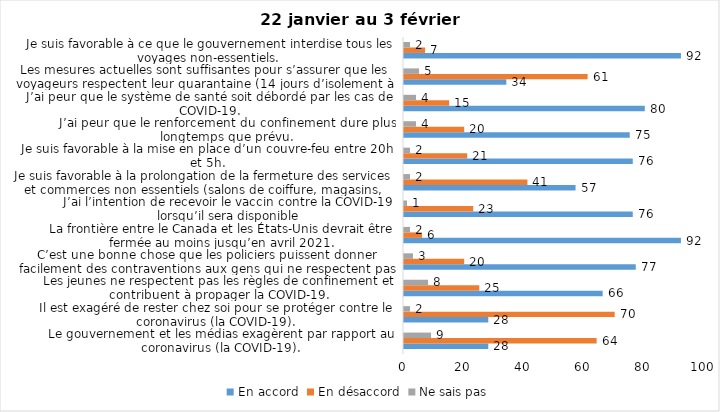
| Category | En accord | En désaccord | Ne sais pas |
|---|---|---|---|
| Le gouvernement et les médias exagèrent par rapport au coronavirus (la COVID-19). | 28 | 64 | 9 |
| Il est exagéré de rester chez soi pour se protéger contre le coronavirus (la COVID-19). | 28 | 70 | 2 |
| Les jeunes ne respectent pas les règles de confinement et contribuent à propager la COVID-19. | 66 | 25 | 8 |
| C’est une bonne chose que les policiers puissent donner facilement des contraventions aux gens qui ne respectent pas les mesures pour prévenir la COVID-19. | 77 | 20 | 3 |
| La frontière entre le Canada et les États-Unis devrait être fermée au moins jusqu’en avril 2021. | 92 | 6 | 2 |
| J’ai l’intention de recevoir le vaccin contre la COVID-19 lorsqu’il sera disponible | 76 | 23 | 1 |
| Je suis favorable à la prolongation de la fermeture des services et commerces non essentiels (salons de coiffure, magasins, industries) jusqu’au 8 février. | 57 | 41 | 2 |
| Je suis favorable à la mise en place d’un couvre-feu entre 20h et 5h. | 76 | 21 | 2 |
| J’ai peur que le renforcement du confinement dure plus longtemps que prévu. | 75 | 20 | 4 |
| J’ai peur que le système de santé soit débordé par les cas de COVID-19. | 80 | 15 | 4 |
| Les mesures actuelles sont suffisantes pour s’assurer que les voyageurs respectent leur quarantaine (14 jours d’isolement à la maison au retour d’un voyage). | 34 | 61 | 5 |
| Je suis favorable à ce que le gouvernement interdise tous les voyages non-essentiels. | 92 | 7 | 2 |